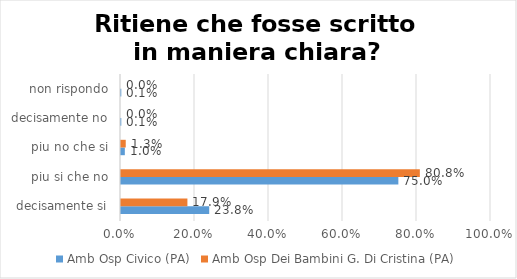
| Category | Amb Osp Civico (PA) | Amb Osp Dei Bambini G. Di Cristina (PA) |
|---|---|---|
| decisamente si | 0.238 | 0.179 |
| piu si che no | 0.75 | 0.808 |
| piu no che si | 0.01 | 0.013 |
| decisamente no | 0.001 | 0 |
| non rispondo | 0.001 | 0 |